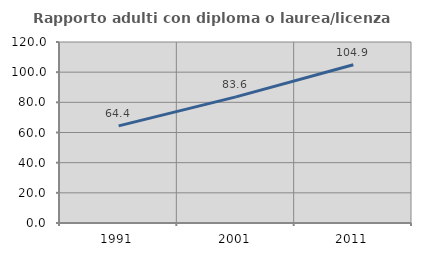
| Category | Rapporto adulti con diploma o laurea/licenza media  |
|---|---|
| 1991.0 | 64.404 |
| 2001.0 | 83.625 |
| 2011.0 | 104.904 |